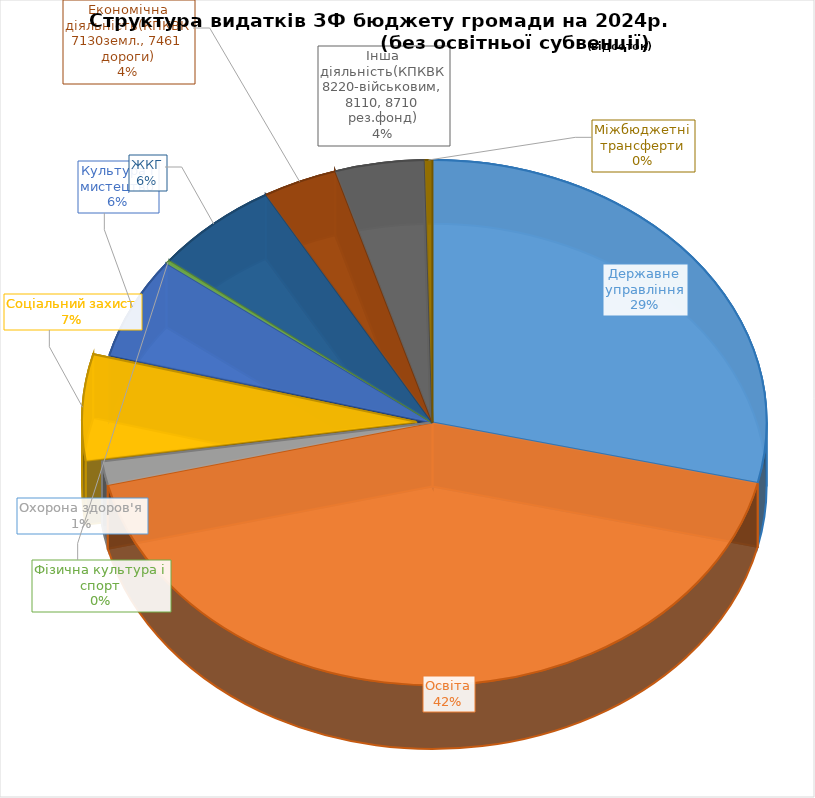
| Category | Структура видатків ЗФ бюджету громади на 2024р.                                                 (без освітньої субвенції) |
|---|---|
| Державне управління | 28.692 |
| Освіта | 42.493 |
| Охорона здоров'я | 1.443 |
| Соціальний захист | 6.521 |
| Культура і мистецтво | 6.208 |
| Фізична культура і спорт | 0.24 |
| ЖКГ | 6.095 |
| Економічна діяльність(КПКВК 7130земл., 7461 дороги) | 3.607 |
| Інша діяльність(КПКВК 8220-військовим, 8110, 8710 рез.фонд) | 4.329 |
| Міжбюджетні трансферти | 0.372 |